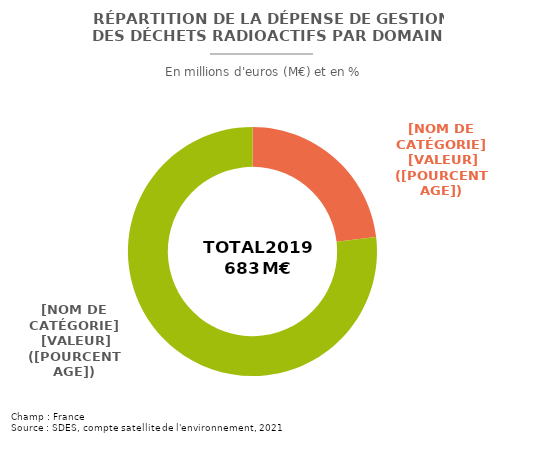
| Category | Series 0 |
|---|---|
| Administrations publiques centrales | 158.155 |
| Entreprises | 525.223 |